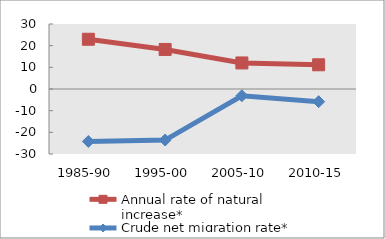
| Category | Annual rate of natural increase* | Crude net migration rate* |
|---|---|---|
| 1985-90 | 22.958 | -24.191 |
| 1995-00 | 18.255 | -23.559 |
| 2005-10 | 12.025 | -3.105 |
| 2010-15 | 11.177 | -5.837 |